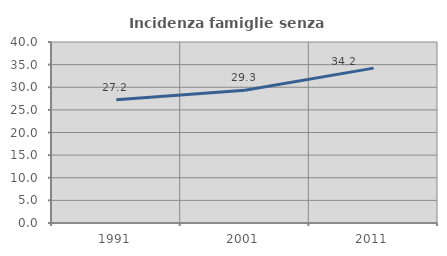
| Category | Incidenza famiglie senza nuclei |
|---|---|
| 1991.0 | 27.237 |
| 2001.0 | 29.321 |
| 2011.0 | 34.23 |